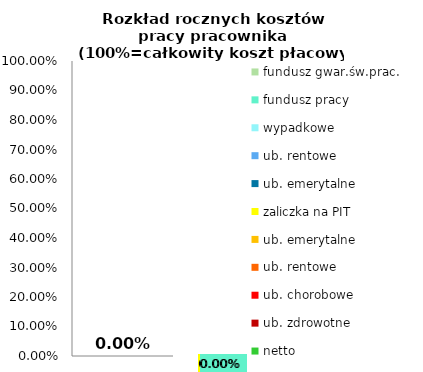
| Category | netto | ub. zdrowotne | ub. chorobowe | ub. rentowe | ub. emerytalne | zaliczka na PIT | ub. emerytalne  | wypadkowe | fundusz pracy | fundusz gwar.św.prac. |
|---|---|---|---|---|---|---|---|---|---|---|
| 0 | 0 | 0 | 0 | 0 | 0 | 0 | 0 | 0 | 0 | 0 |